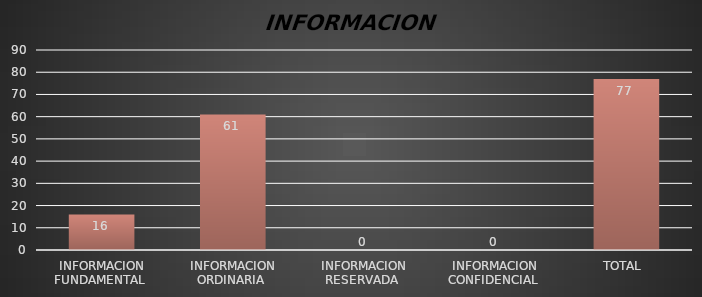
| Category | Series 1 |
|---|---|
| INFORMACION FUNDAMENTAL  | 16 |
| INFORMACION ORDINARIA  | 61 |
| INFORMACION RESERVADA  | 0 |
| INFORMACION CONFIDENCIAL  | 0 |
| TOTAL  | 77 |